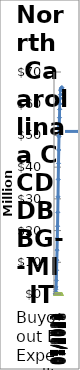
| Category | Projected Expenditures | Actual Expenditure |
|---|---|---|
| 07/2021 | 0 | 0 |
| 10/2021 | 125000 | 0 |
| 01/2022 | 725000 | 0 |
| 04/2022 | 1475000 | 0 |
| 07/2022 | 2225000 | 0 |
| 10/2022 | 4285000 | 0 |
| 01/2023 | 7467700 | 0 |
| 04/2023 | 10650400 | 0 |
| 07/2023 | 13833100 | 0 |
| 10/2023 | 17546250 | 0 |
| 01/2024 | 21370794.5 | 0 |
| 04/2024 | 25741702.5 | 0 |
| 07/2024 | 30658974 | 0 |
| 10/2024 | 36122609 | 0 |
| 01/2025 | 41187398.645 | 0 |
| 04/2025 | 45408056.682 | 0 |
| 07/2025 | 49628714.72 | 0 |
| 10/2025 | 53005241.15 | 0 |
| 01/2026 | 55613607.817 | 0 |
| 04/2026 | 58221974.484 | 0 |
| 07/2026 | 59960885.596 | 0 |
| 10/2026 | 61699796.707 | 0 |
| 01/2027 | 62893849.004 | 0 |
| 04/2027 | 64087901.3 | 0 |
| 07/2027 | 64386414.374 | 0 |
| 10/2027 | 64625224.834 | 0 |
| 01/2028 | 64864035.293 | 0 |
| 04/2028 | 64983440.523 | 0 |
| 07/2028 | 65117399.752 | 0 |